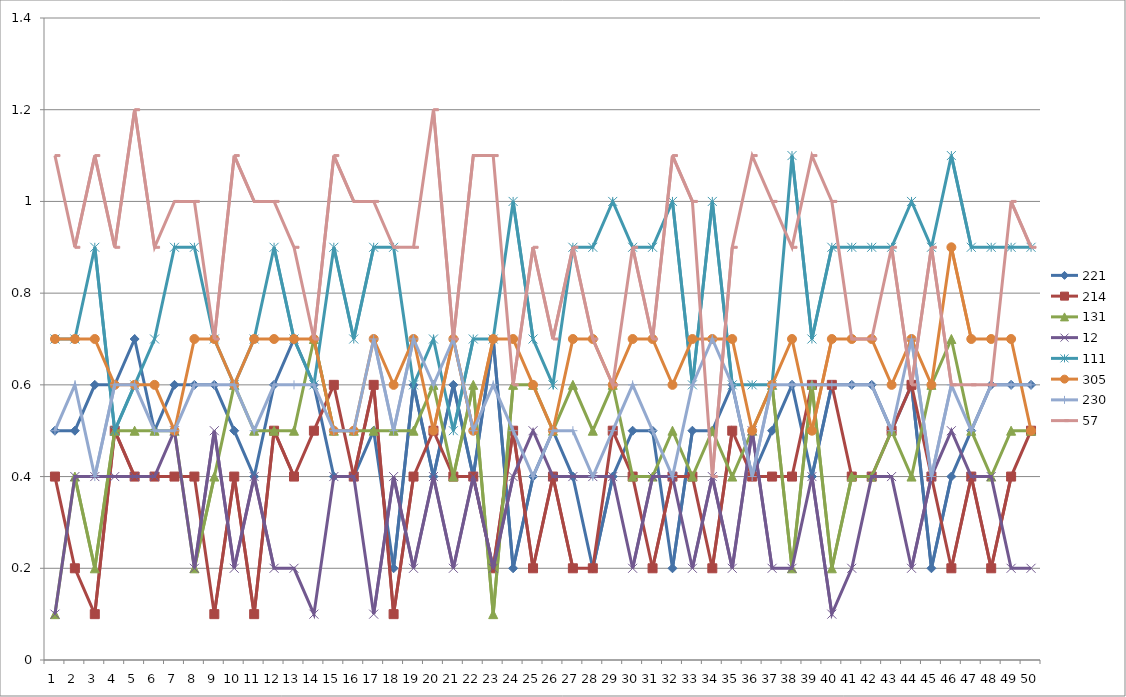
| Category | 221 | 214 | 131 | 12 | 111 | 305 | 230 | 57 |
|---|---|---|---|---|---|---|---|---|
| 0 | 0.5 | 0.4 | 0.1 | 0.1 | 0.7 | 0.7 | 0.5 | 1.1 |
| 1 | 0.5 | 0.2 | 0.4 | 0.4 | 0.7 | 0.7 | 0.6 | 0.9 |
| 2 | 0.6 | 0.1 | 0.2 | 0.4 | 0.9 | 0.7 | 0.4 | 1.1 |
| 3 | 0.6 | 0.5 | 0.5 | 0.4 | 0.5 | 0.6 | 0.6 | 0.9 |
| 4 | 0.7 | 0.4 | 0.5 | 0.4 | 0.6 | 0.6 | 0.6 | 1.2 |
| 5 | 0.5 | 0.4 | 0.5 | 0.4 | 0.7 | 0.6 | 0.5 | 0.9 |
| 6 | 0.6 | 0.4 | 0.5 | 0.5 | 0.9 | 0.5 | 0.5 | 1 |
| 7 | 0.6 | 0.4 | 0.2 | 0.2 | 0.9 | 0.7 | 0.6 | 1 |
| 8 | 0.6 | 0.1 | 0.4 | 0.5 | 0.7 | 0.7 | 0.6 | 0.7 |
| 9 | 0.5 | 0.4 | 0.6 | 0.2 | 0.6 | 0.6 | 0.6 | 1.1 |
| 10 | 0.4 | 0.1 | 0.5 | 0.4 | 0.7 | 0.7 | 0.5 | 1 |
| 11 | 0.6 | 0.5 | 0.5 | 0.2 | 0.9 | 0.7 | 0.6 | 1 |
| 12 | 0.7 | 0.4 | 0.5 | 0.2 | 0.7 | 0.7 | 0.6 | 0.9 |
| 13 | 0.6 | 0.5 | 0.7 | 0.1 | 0.6 | 0.7 | 0.6 | 0.7 |
| 14 | 0.4 | 0.6 | 0.5 | 0.4 | 0.9 | 0.5 | 0.5 | 1.1 |
| 15 | 0.4 | 0.4 | 0.5 | 0.4 | 0.7 | 0.5 | 0.5 | 1 |
| 16 | 0.5 | 0.6 | 0.5 | 0.1 | 0.9 | 0.7 | 0.7 | 1 |
| 17 | 0.2 | 0.1 | 0.5 | 0.4 | 0.9 | 0.6 | 0.5 | 0.9 |
| 18 | 0.6 | 0.4 | 0.5 | 0.2 | 0.6 | 0.7 | 0.7 | 0.9 |
| 19 | 0.4 | 0.5 | 0.6 | 0.4 | 0.7 | 0.5 | 0.6 | 1.2 |
| 20 | 0.6 | 0.4 | 0.4 | 0.2 | 0.5 | 0.7 | 0.7 | 0.7 |
| 21 | 0.4 | 0.4 | 0.6 | 0.4 | 0.7 | 0.5 | 0.5 | 1.1 |
| 22 | 0.7 | 0.2 | 0.1 | 0.2 | 0.7 | 0.7 | 0.6 | 1.1 |
| 23 | 0.2 | 0.5 | 0.6 | 0.4 | 1 | 0.7 | 0.5 | 0.6 |
| 24 | 0.4 | 0.2 | 0.6 | 0.5 | 0.7 | 0.6 | 0.4 | 0.9 |
| 25 | 0.5 | 0.4 | 0.5 | 0.4 | 0.6 | 0.5 | 0.5 | 0.7 |
| 26 | 0.4 | 0.2 | 0.6 | 0.4 | 0.9 | 0.7 | 0.5 | 0.9 |
| 27 | 0.2 | 0.2 | 0.5 | 0.4 | 0.9 | 0.7 | 0.4 | 0.7 |
| 28 | 0.4 | 0.5 | 0.6 | 0.4 | 1 | 0.6 | 0.5 | 0.6 |
| 29 | 0.5 | 0.4 | 0.4 | 0.2 | 0.9 | 0.7 | 0.6 | 0.9 |
| 30 | 0.5 | 0.2 | 0.4 | 0.4 | 0.9 | 0.7 | 0.5 | 0.7 |
| 31 | 0.2 | 0.4 | 0.5 | 0.4 | 1 | 0.6 | 0.4 | 1.1 |
| 32 | 0.5 | 0.4 | 0.4 | 0.2 | 0.6 | 0.7 | 0.6 | 1 |
| 33 | 0.5 | 0.2 | 0.5 | 0.4 | 1 | 0.7 | 0.7 | 0.4 |
| 34 | 0.6 | 0.5 | 0.4 | 0.2 | 0.6 | 0.7 | 0.6 | 0.9 |
| 35 | 0.4 | 0.4 | 0.5 | 0.5 | 0.6 | 0.5 | 0.4 | 1.1 |
| 36 | 0.5 | 0.4 | 0.6 | 0.2 | 0.6 | 0.6 | 0.6 | 1 |
| 37 | 0.6 | 0.4 | 0.2 | 0.2 | 1.1 | 0.7 | 0.6 | 0.9 |
| 38 | 0.4 | 0.6 | 0.6 | 0.4 | 0.7 | 0.5 | 0.6 | 1.1 |
| 39 | 0.6 | 0.6 | 0.2 | 0.1 | 0.9 | 0.7 | 0.6 | 1 |
| 40 | 0.6 | 0.4 | 0.4 | 0.2 | 0.9 | 0.7 | 0.6 | 0.7 |
| 41 | 0.6 | 0.4 | 0.4 | 0.4 | 0.9 | 0.7 | 0.6 | 0.7 |
| 42 | 0.5 | 0.5 | 0.5 | 0.4 | 0.9 | 0.6 | 0.5 | 0.9 |
| 43 | 0.6 | 0.6 | 0.4 | 0.2 | 1 | 0.7 | 0.7 | 0.6 |
| 44 | 0.2 | 0.4 | 0.6 | 0.4 | 0.9 | 0.6 | 0.4 | 0.9 |
| 45 | 0.4 | 0.2 | 0.7 | 0.5 | 1.1 | 0.9 | 0.6 | 0.6 |
| 46 | 0.5 | 0.4 | 0.5 | 0.4 | 0.9 | 0.7 | 0.5 | 0.6 |
| 47 | 0.6 | 0.2 | 0.4 | 0.4 | 0.9 | 0.7 | 0.6 | 0.6 |
| 48 | 0.6 | 0.4 | 0.5 | 0.2 | 0.9 | 0.7 | 0.6 | 1 |
| 49 | 0.6 | 0.5 | 0.5 | 0.2 | 0.9 | 0.5 | 0.6 | 0.9 |